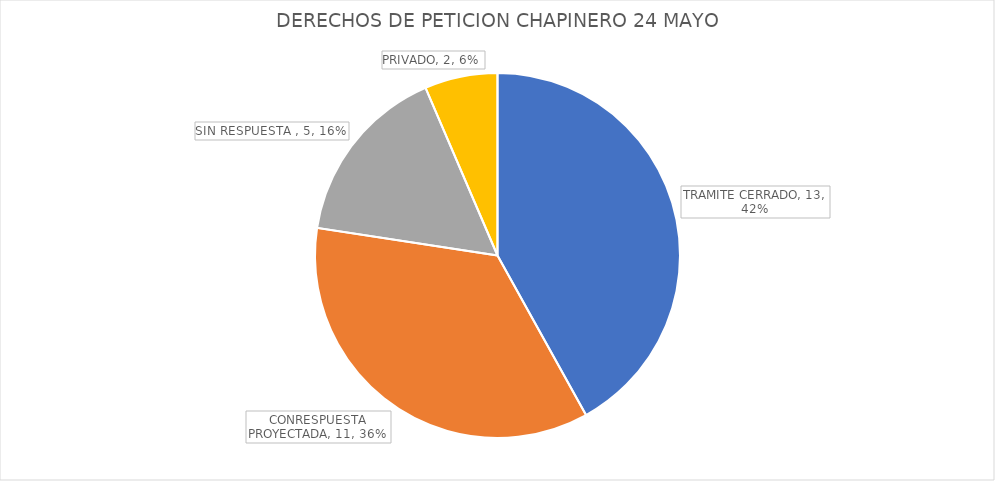
| Category | CANTIDAD |
|---|---|
| TRAMITE CERRADO | 13 |
| CONRESPUESTA PROYECTADA | 11 |
| SIN RESPUESTA  | 5 |
| PRIVADO | 2 |